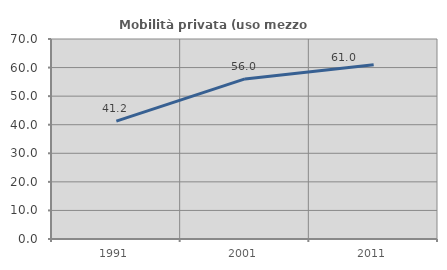
| Category | Mobilità privata (uso mezzo privato) |
|---|---|
| 1991.0 | 41.241 |
| 2001.0 | 56.035 |
| 2011.0 | 61.024 |